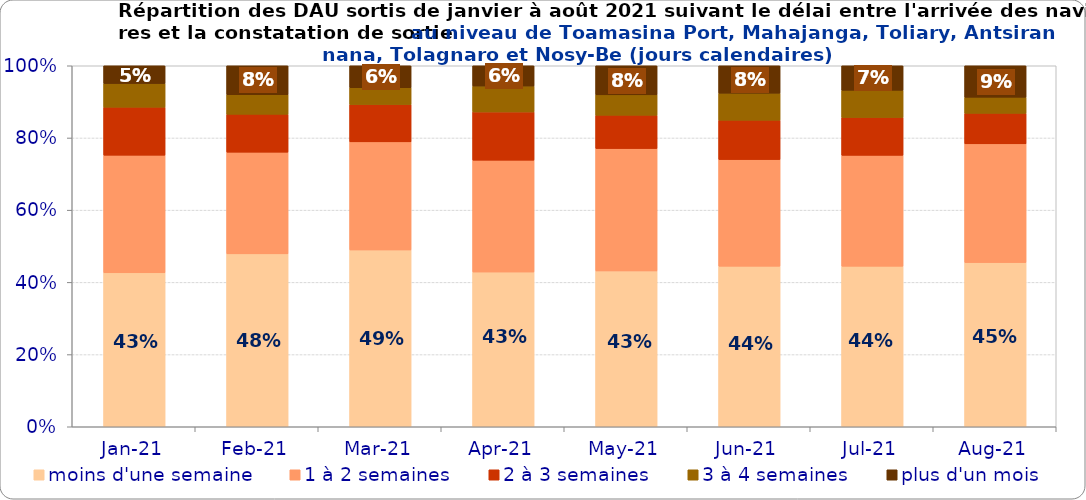
| Category | moins d'une semaine | 1 à 2 semaines | 2 à 3 semaines | 3 à 4 semaines | plus d'un mois |
|---|---|---|---|---|---|
| 2021-01-01 | 0.426 | 0.326 | 0.133 | 0.065 | 0.049 |
| 2021-02-01 | 0.479 | 0.282 | 0.105 | 0.054 | 0.08 |
| 2021-03-01 | 0.49 | 0.299 | 0.103 | 0.047 | 0.061 |
| 2021-04-01 | 0.429 | 0.31 | 0.134 | 0.072 | 0.056 |
| 2021-05-01 | 0.432 | 0.339 | 0.092 | 0.056 | 0.081 |
| 2021-06-01 | 0.445 | 0.295 | 0.109 | 0.075 | 0.076 |
| 2021-07-01 | 0.445 | 0.307 | 0.105 | 0.075 | 0.068 |
| 2021-08-01 | 0.455 | 0.329 | 0.084 | 0.045 | 0.087 |